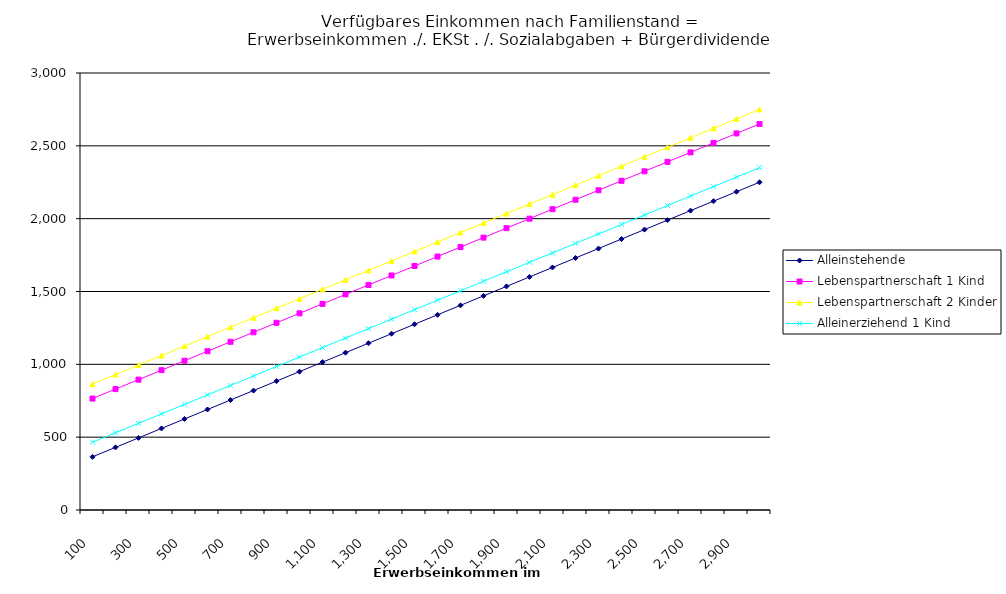
| Category | Alleinstehende | Lebenspartnerschaft 1 Kind | Lebenspartnerschaft 2 Kinder | Alleinerziehend 1 Kind |
|---|---|---|---|---|
| 100.0 | 365 | 765 | 865 | 465 |
| 200.0 | 430 | 830 | 930 | 530 |
| 300.0 | 495 | 895 | 995 | 595 |
| 400.0 | 560 | 960 | 1060 | 660 |
| 500.0 | 625 | 1025 | 1125 | 725 |
| 600.0 | 690 | 1090 | 1190 | 790 |
| 700.0 | 755 | 1155 | 1255 | 855 |
| 800.0 | 820 | 1220 | 1320 | 920 |
| 900.0 | 885 | 1285 | 1385 | 985 |
| 1000.0 | 950 | 1350 | 1450 | 1050 |
| 1100.0 | 1015 | 1415 | 1515 | 1115 |
| 1200.0 | 1080 | 1480 | 1580 | 1180 |
| 1300.0 | 1145 | 1545 | 1645 | 1245 |
| 1400.0 | 1210 | 1610 | 1710 | 1310 |
| 1500.0 | 1275 | 1675 | 1775 | 1375 |
| 1600.0 | 1340 | 1740 | 1840 | 1440 |
| 1700.0 | 1405 | 1805 | 1905 | 1505 |
| 1800.0 | 1470 | 1870 | 1970 | 1570 |
| 1900.0 | 1535 | 1935 | 2035 | 1635 |
| 2000.0 | 1600 | 2000 | 2100 | 1700 |
| 2100.0 | 1665 | 2065 | 2165 | 1765 |
| 2200.0 | 1730 | 2130 | 2230 | 1830 |
| 2300.0 | 1795 | 2195 | 2295 | 1895 |
| 2400.0 | 1860 | 2260 | 2360 | 1960 |
| 2500.0 | 1925 | 2325 | 2425 | 2025 |
| 2600.0 | 1990 | 2390 | 2490 | 2090 |
| 2700.0 | 2055 | 2455 | 2555 | 2155 |
| 2800.0 | 2120 | 2520 | 2620 | 2220 |
| 2900.0 | 2185 | 2585 | 2685 | 2285 |
| 3000.0 | 2250 | 2650 | 2750 | 2350 |